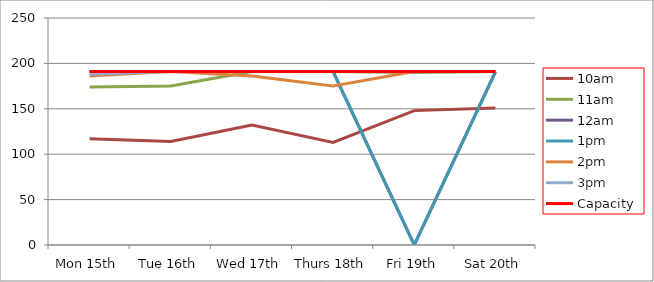
| Category | 9am | 10am | 11am | 12am | 1pm | 2pm | 3pm | 4pm | 5pm | Capacity |
|---|---|---|---|---|---|---|---|---|---|---|
| Mon 15th |  | 117 | 174 | 191 | 191 | 186 | 188 |  |  | 191 |
| Tue 16th |  | 114 | 175 | 191 | 191 | 191 | 191 |  |  | 191 |
| Wed 17th |  | 132 | 191 | 191 | 191 | 186 | 191 |  |  | 191 |
| Thurs 18th |  | 113 | 191 | 191 | 191 | 175 | 191 |  |  | 191 |
| Fri 19th |  | 148 | 190 | 0 | 0 | 191 | 191 |  |  | 191 |
| Sat 20th |  | 151 | 191 | 191 | 190 | 191 | 191 |  |  | 191 |